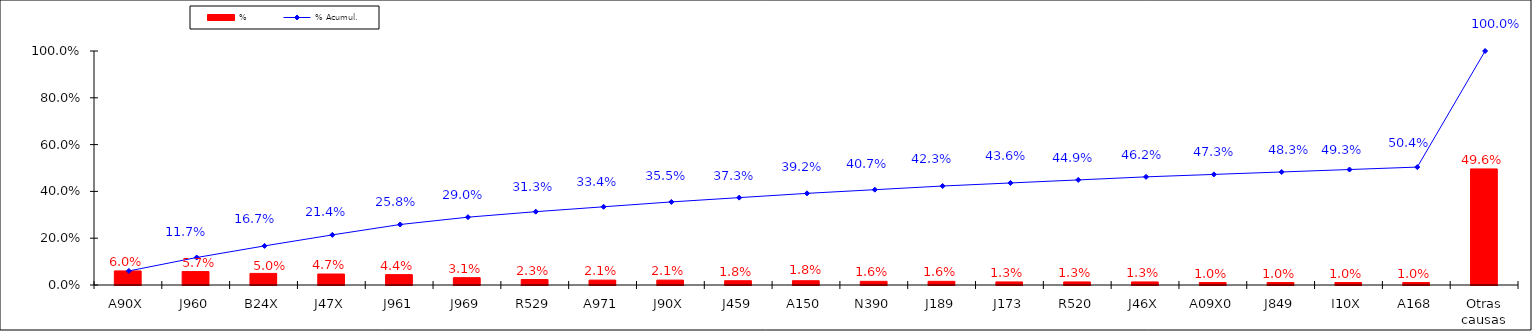
| Category | % |
|---|---|
| A90X | 0.06 |
| J960 | 0.057 |
| B24X | 0.05 |
| J47X | 0.047 |
| J961 | 0.044 |
| J969 | 0.031 |
| R529 | 0.023 |
| A971 | 0.021 |
| J90X | 0.021 |
| J459 | 0.018 |
| A150 | 0.018 |
| N390 | 0.016 |
| J189 | 0.016 |
| J173 | 0.013 |
| R520 | 0.013 |
| J46X | 0.013 |
| A09X0 | 0.01 |
| J849 | 0.01 |
| I10X | 0.01 |
| A168 | 0.01 |
| Otras causas | 0.496 |